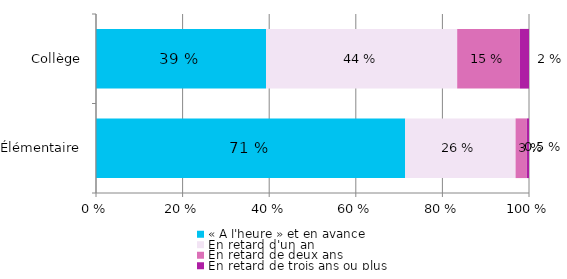
| Category | « À l'heure » et en avance | En retard d'un an | En retard de deux ans | En retard de trois ans ou plus |
|---|---|---|---|---|
| Élémentaire | 0.714 | 0.255 | 0.026 | 0.005 |
| Collège | 0.393 | 0.442 | 0.145 | 0.021 |